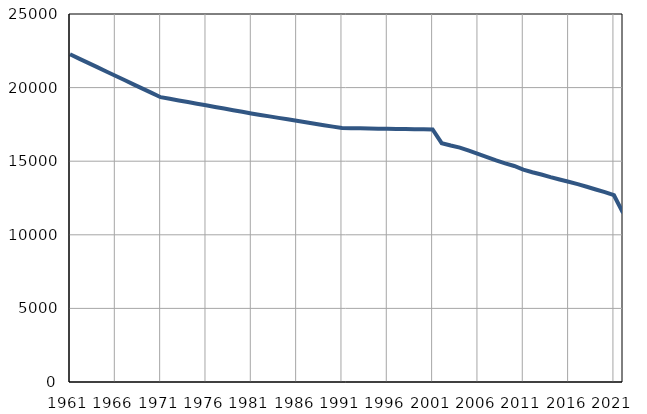
| Category | Број
становника |
|---|---|
| 1961.0 | 22262 |
| 1962.0 | 21971 |
| 1963.0 | 21680 |
| 1964.0 | 21388 |
| 1965.0 | 21096 |
| 1966.0 | 20805 |
| 1967.0 | 20514 |
| 1968.0 | 20222 |
| 1969.0 | 19931 |
| 1970.0 | 19639 |
| 1971.0 | 19348 |
| 1972.0 | 19238 |
| 1973.0 | 19128 |
| 1974.0 | 19017 |
| 1975.0 | 18906 |
| 1976.0 | 18795 |
| 1977.0 | 18685 |
| 1978.0 | 18575 |
| 1979.0 | 18464 |
| 1980.0 | 18354 |
| 1981.0 | 18243 |
| 1982.0 | 18144 |
| 1983.0 | 18044 |
| 1984.0 | 17944 |
| 1985.0 | 17844 |
| 1986.0 | 17746 |
| 1987.0 | 17647 |
| 1988.0 | 17547 |
| 1989.0 | 17447 |
| 1990.0 | 17348 |
| 1991.0 | 17249 |
| 1992.0 | 17239 |
| 1993.0 | 17230 |
| 1994.0 | 17220 |
| 1995.0 | 17211 |
| 1996.0 | 17201 |
| 1997.0 | 17192 |
| 1998.0 | 17182 |
| 1999.0 | 17173 |
| 2000.0 | 17163 |
| 2001.0 | 17154 |
| 2002.0 | 16226 |
| 2003.0 | 16066 |
| 2004.0 | 15925 |
| 2005.0 | 15711 |
| 2006.0 | 15493 |
| 2007.0 | 15283 |
| 2008.0 | 15054 |
| 2009.0 | 14850 |
| 2010.0 | 14676 |
| 2011.0 | 14425 |
| 2012.0 | 14251 |
| 2013.0 | 14097 |
| 2014.0 | 13917 |
| 2015.0 | 13753 |
| 2016.0 | 13601 |
| 2017.0 | 13439 |
| 2018.0 | 13265 |
| 2019.0 | 13079 |
| 2020.0 | 12901 |
| 2021.0 | 12688 |
| 2022.0 | 11484 |